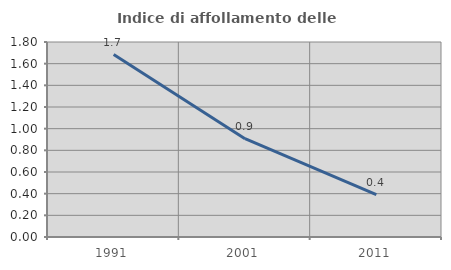
| Category | Indice di affollamento delle abitazioni  |
|---|---|
| 1991.0 | 1.684 |
| 2001.0 | 0.908 |
| 2011.0 | 0.392 |